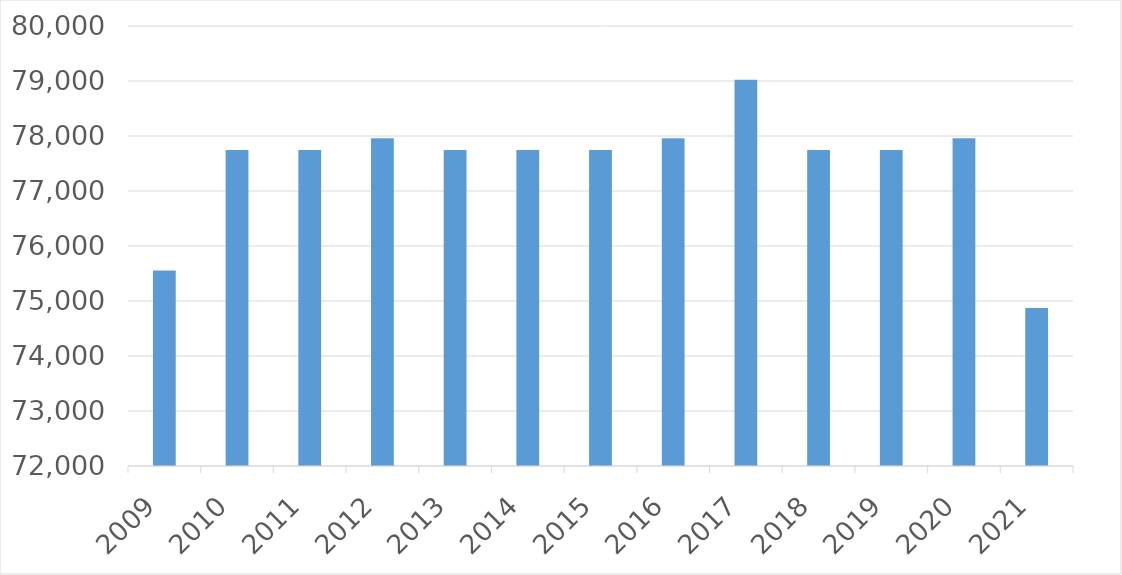
| Category | Series 0 |
|---|---|
| 2009 | 75555 |
| 2010 | 77745 |
| 2011 | 77745 |
| 2012 | 77958 |
| 2013 | 77745 |
| 2014 | 77745 |
| 2015 | 77745 |
| 2016 | 77958 |
| 2017 | 79023 |
| 2018 | 77745 |
| 2019 | 77745 |
| 2020 | 77958 |
| 2021 | 74871 |